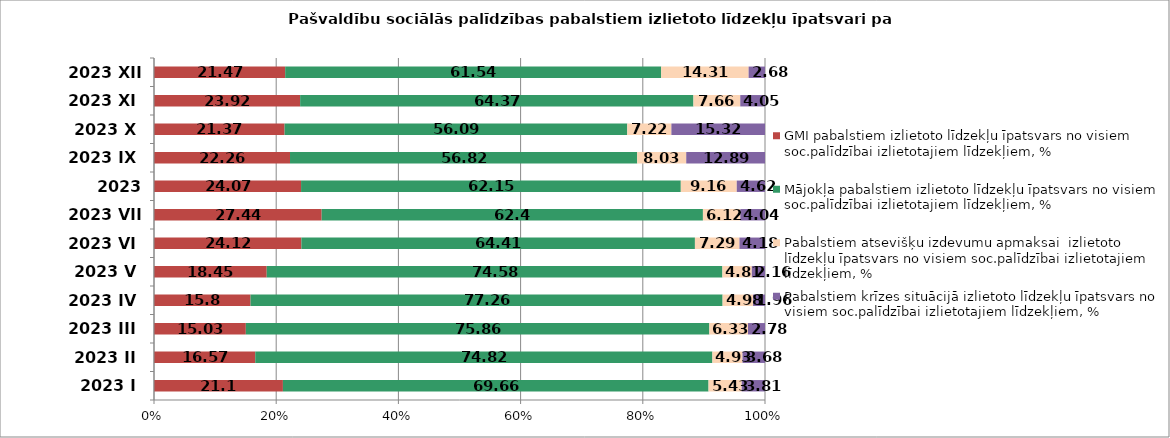
| Category | GMI pabalstiem izlietoto līdzekļu īpatsvars no visiem soc.palīdzībai izlietotajiem līdzekļiem, % | Mājokļa pabalstiem izlietoto līdzekļu īpatsvars no visiem soc.palīdzībai izlietotajiem līdzekļiem, % | Pabalstiem atsevišķu izdevumu apmaksai  izlietoto līdzekļu īpatsvars no visiem soc.palīdzībai izlietotajiem līdzekļiem, % | Pabalstiem krīzes situācijā izlietoto līdzekļu īpatsvars no visiem soc.palīdzībai izlietotajiem līdzekļiem, % |
|---|---|---|---|---|
| 2023 I | 21.1 | 69.66 | 5.43 | 3.81 |
| 2023 II | 16.57 | 74.82 | 4.93 | 3.68 |
| 2023 III | 15.03 | 75.86 | 6.33 | 2.78 |
| 2023 IV | 15.8 | 77.26 | 4.98 | 1.96 |
| 2023 V | 18.45 | 74.58 | 4.81 | 2.16 |
| 2023 VI | 24.12 | 64.41 | 7.29 | 4.18 |
| 2023 VII | 27.44 | 62.4 | 6.12 | 4.04 |
| 2023 VIII | 24.07 | 62.15 | 9.16 | 4.62 |
| 2023 IX | 22.26 | 56.82 | 8.03 | 12.89 |
| 2023 X | 21.37 | 56.09 | 7.22 | 15.32 |
| 2023 XI | 23.92 | 64.37 | 7.66 | 4.05 |
| 2023 XII | 21.47 | 61.54 | 14.31 | 2.68 |